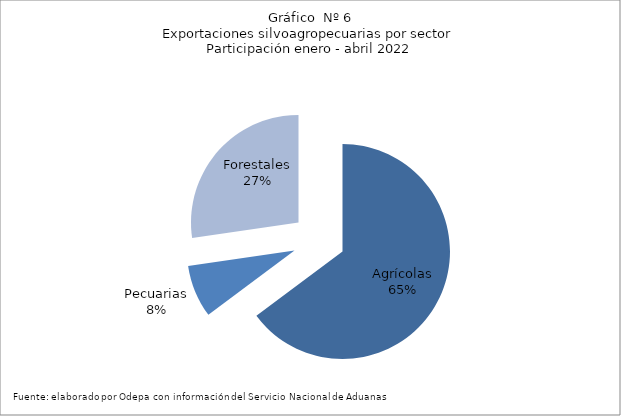
| Category | Series 0 |
|---|---|
| Agrícolas | 4634026 |
| Pecuarias | 566854 |
| Forestales | 1952062 |